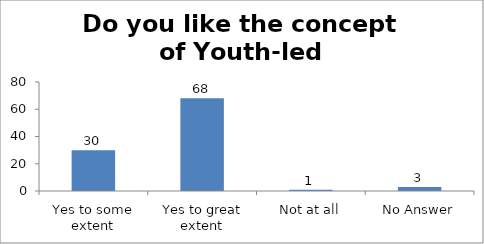
| Category | Do you like the concept of Youth-led Changemaking?  |
|---|---|
| Yes to some extent | 30 |
| Yes to great extent | 68 |
| Not at all | 1 |
| No Answer | 3 |